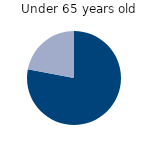
| Category | Under 65 years old |
|---|---|
| Full time | 78 |
| Part time | 22 |